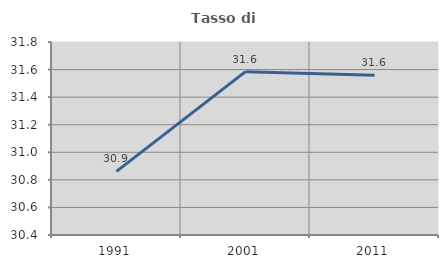
| Category | Tasso di occupazione   |
|---|---|
| 1991.0 | 30.861 |
| 2001.0 | 31.585 |
| 2011.0 | 31.558 |